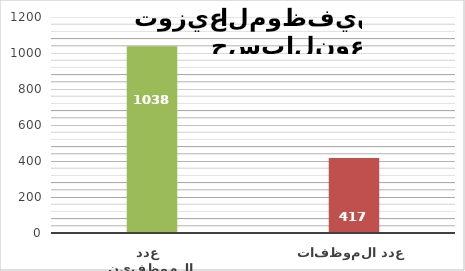
| Category | Series 1 |
|---|---|
| عدد الموظفين   | 1038 |
| عدد الموظفات   | 417 |